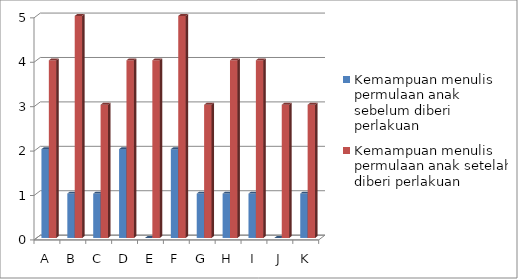
| Category | Kemampuan menulis permulaan anak sebelum diberi perlakuan | Kemampuan menulis permulaan anak setelah diberi perlakuan |
|---|---|---|
| A | 2 | 4 |
| B | 1 | 5 |
| C | 1 | 3 |
| D | 2 | 4 |
| E | 0 | 4 |
| F | 2 | 5 |
| G | 1 | 3 |
| H | 1 | 4 |
| I | 1 | 4 |
| J | 0 | 3 |
| K | 1 | 3 |